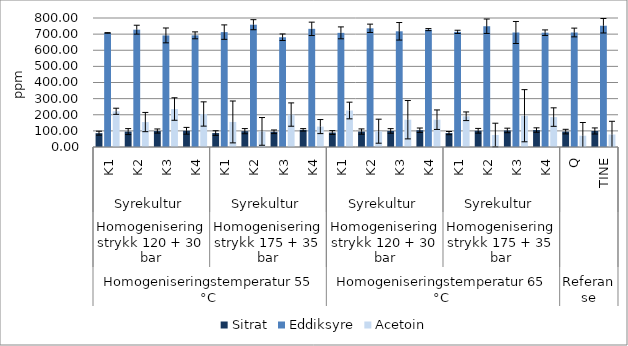
| Category | Sitrat | Eddiksyre | Acetoin |
|---|---|---|---|
| 0 | 85.703 | 707.357 | 221.438 |
| 1 | 95.58 | 727.587 | 154.764 |
| 2 | 99.01 | 691.997 | 235.51 |
| 3 | 100.563 | 692.483 | 204.674 |
| 4 | 86.397 | 712.41 | 155.374 |
| 5 | 98.22 | 758.45 | 96.809 |
| 6 | 94.347 | 680.643 | 201.142 |
| 7 | 106.363 | 732.807 | 126.666 |
| 8 | 89.57 | 707.86 | 226.313 |
| 9 | 95.75 | 736.08 | 97.978 |
| 10 | 99.613 | 717.537 | 169.261 |
| 11 | 103.947 | 728.003 | 169.299 |
| 12 | 86.22 | 714.05 | 190.627 |
| 13 | 100.597 | 748.933 | 74.318 |
| 14 | 102.6 | 710.183 | 194.026 |
| 15 | 105.163 | 708.947 | 185.538 |
| 16 | 95.513 | 710.127 | 70.026 |
| 17 | 99.357 | 752.043 | 77.353 |